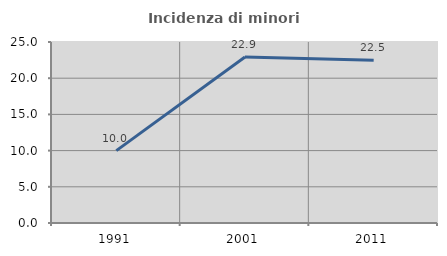
| Category | Incidenza di minori stranieri |
|---|---|
| 1991.0 | 10 |
| 2001.0 | 22.917 |
| 2011.0 | 22.464 |